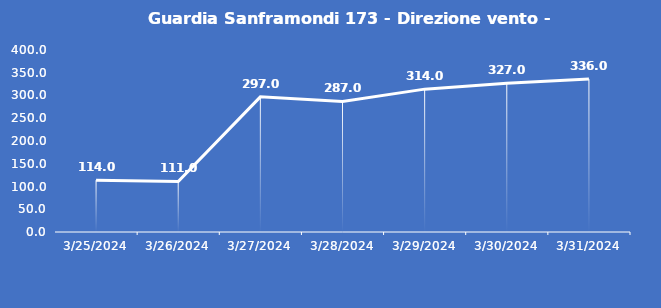
| Category | Guardia Sanframondi 173 - Direzione vento - Grezzo (°N) |
|---|---|
| 3/25/24 | 114 |
| 3/26/24 | 111 |
| 3/27/24 | 297 |
| 3/28/24 | 287 |
| 3/29/24 | 314 |
| 3/30/24 | 327 |
| 3/31/24 | 336 |